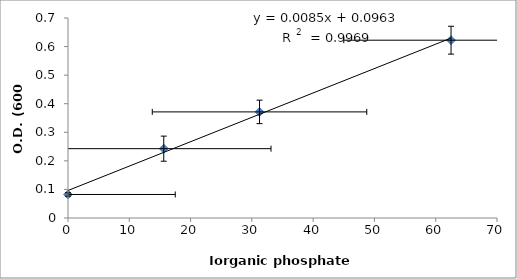
| Category | Series 0 |
|---|---|
| 62.5 | 0.622 |
| 31.25 | 0.371 |
| 15.625 | 0.243 |
| 0.0 | 0.082 |